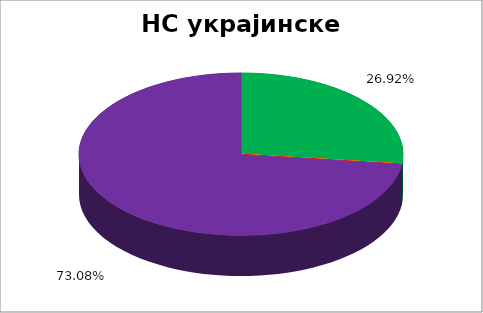
| Category | НС украјинске НМ |
|---|---|
| 0 | 0.269 |
| 1 | 0 |
| 2 | 0 |
| 3 | 0 |
| 4 | 0.731 |